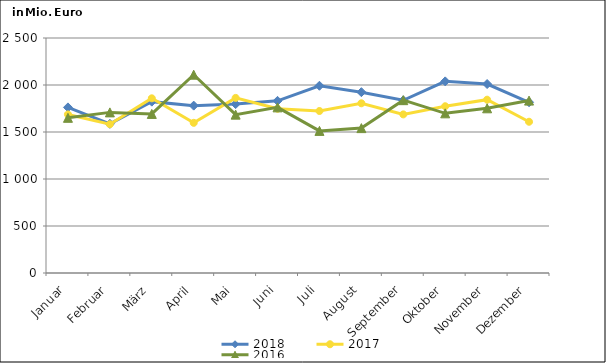
| Category | 2018 | 2017 | 2016 |
|---|---|---|---|
| Januar | 1761.673 | 1687.048 | 1650.879 |
| Februar | 1586.845 | 1582.678 | 1708.645 |
| März | 1822.966 | 1858.326 | 1692.271 |
| April | 1780.425 | 1597.556 | 2109.648 |
| Mai | 1796.594 | 1862.56 | 1684.742 |
| Juni | 1831.443 | 1747.243 | 1761.976 |
| Juli | 1992.014 | 1723.336 | 1511.726 |
| August | 1923.713 | 1805.426 | 1541.385 |
| September | 1837.198 | 1687.333 | 1838.624 |
| Oktober | 2038.552 | 1773.986 | 1698.524 |
| November | 2010.261 | 1843.798 | 1752.059 |
| Dezember | 1816.448 | 1609.054 | 1834.063 |